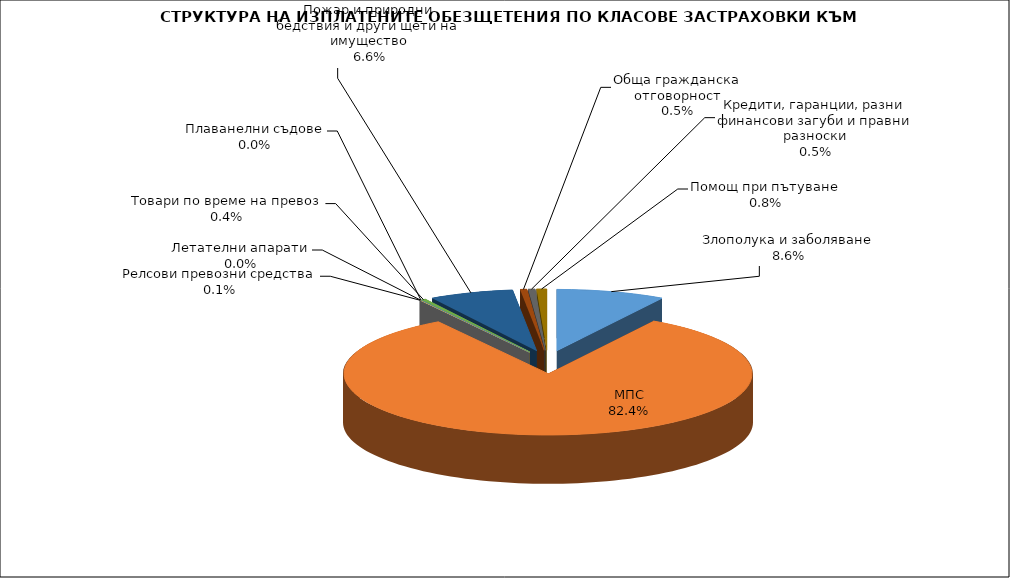
| Category | Злополука и заболяване |
|---|---|
| Злополука и заболяване | 0.086 |
| МПС | 0.824 |
| Релсови превозни средства | 0.001 |
| Летателни апарати | 0 |
| Плаванелни съдове | 0 |
| Товари по време на превоз | 0.004 |
| Пожар и природни бедствия и други щети на имущество | 0.066 |
| Обща гражданска отговорност | 0.005 |
| Кредити, гаранции, разни финансови загуби и правни разноски | 0.005 |
| Помощ при пътуване | 0.008 |